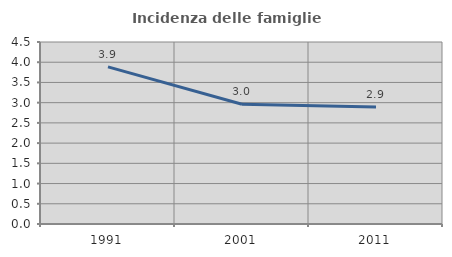
| Category | Incidenza delle famiglie numerose |
|---|---|
| 1991.0 | 3.885 |
| 2001.0 | 2.961 |
| 2011.0 | 2.894 |